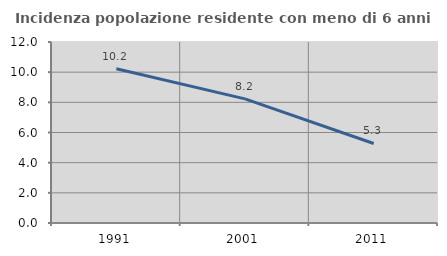
| Category | Incidenza popolazione residente con meno di 6 anni |
|---|---|
| 1991.0 | 10.226 |
| 2001.0 | 8.229 |
| 2011.0 | 5.273 |